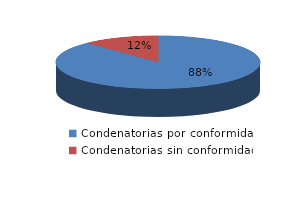
| Category | Series 0 |
|---|---|
| 0 | 51 |
| 1 | 7 |